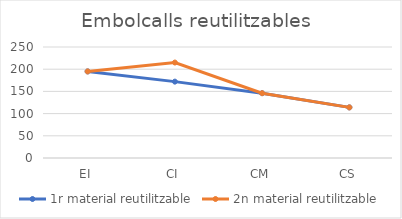
| Category | 1r material reutilitzable | 2n material reutilitzable |
|---|---|---|
| EI | 195 | 0 |
| CI | 172 | 43 |
| CM | 146 | 0 |
| CS | 114 | 0 |